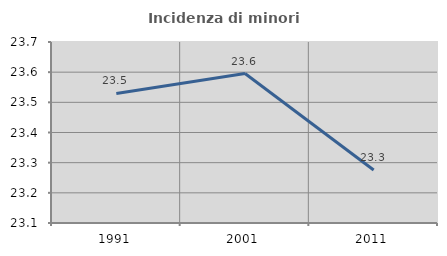
| Category | Incidenza di minori stranieri |
|---|---|
| 1991.0 | 23.529 |
| 2001.0 | 23.596 |
| 2011.0 | 23.276 |